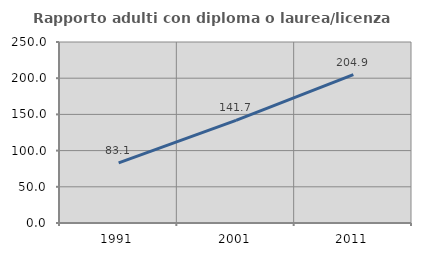
| Category | Rapporto adulti con diploma o laurea/licenza media  |
|---|---|
| 1991.0 | 83.051 |
| 2001.0 | 141.667 |
| 2011.0 | 204.878 |